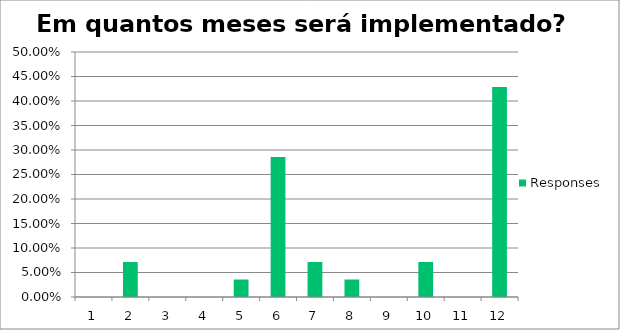
| Category | Responses |
|---|---|
| 1 | 0 |
| 2 | 0.071 |
| 3 | 0 |
| 4 | 0 |
| 5 | 0.036 |
| 6 | 0.286 |
| 7 | 0.071 |
| 8 | 0.036 |
| 9 | 0 |
| 10 | 0.071 |
| 11 | 0 |
| 12 | 0.429 |